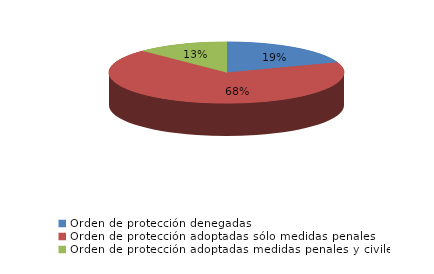
| Category | Series 0 |
|---|---|
| Orden de protección denegadas | 155 |
| Orden de protección adoptadas sólo medidas penales | 540 |
| Orden de protección adoptadas medidas penales y civiles | 100 |